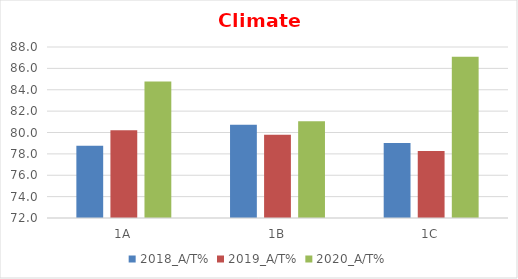
| Category | 2018_A/T% | 2019_A/T% | 2020_A/T% |
|---|---|---|---|
| 1A | 78.75 | 80.22 | 84.783 |
| 1B | 80.723 | 79.787 | 81.053 |
| 1C | 79.012 | 78.261 | 87.097 |